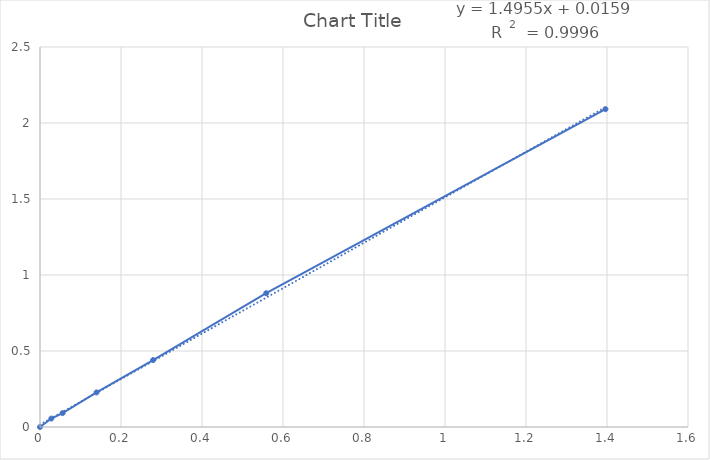
| Category | Series 0 |
|---|---|
| 0.0 | 0 |
| 0.027925 | 0.055 |
| 0.05585 | 0.092 |
| 0.139625 | 0.227 |
| 0.27925 | 0.44 |
| 0.5585 | 0.88 |
| 1.39625 | 2.091 |